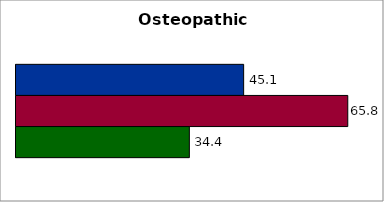
| Category | 50 states and D.C. | SREB states | State |
|---|---|---|---|
| 0 | 45.142 | 65.789 | 34.375 |